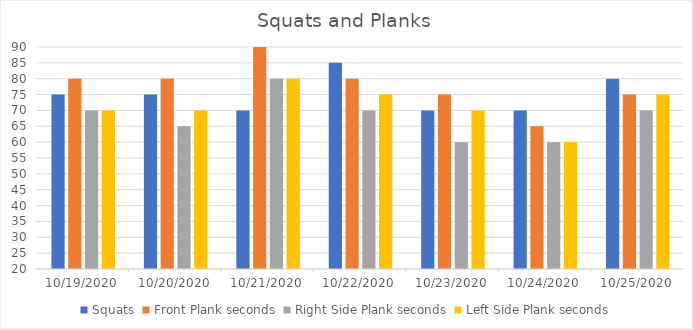
| Category | Squats | Front Plank seconds | Right Side Plank seconds | Left Side Plank seconds |
|---|---|---|---|---|
| 10/19/20 | 75 | 80 | 70 | 70 |
| 10/20/20 | 75 | 80 | 65 | 70 |
| 10/21/20 | 70 | 90 | 80 | 80 |
| 10/22/20 | 85 | 80 | 70 | 75 |
| 10/23/20 | 70 | 75 | 60 | 70 |
| 10/24/20 | 70 | 65 | 60 | 60 |
| 10/25/20 | 80 | 75 | 70 | 75 |